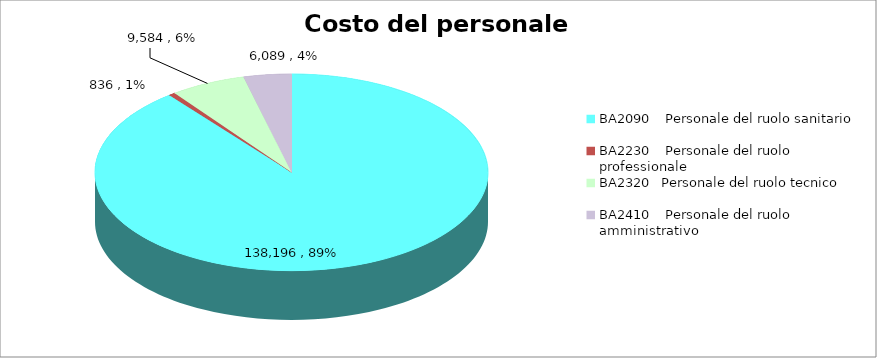
| Category | Series 0 |
|---|---|
| 0 | 138196 |
| 1 | 836 |
| 2 | 9584 |
| 3 | 6089 |